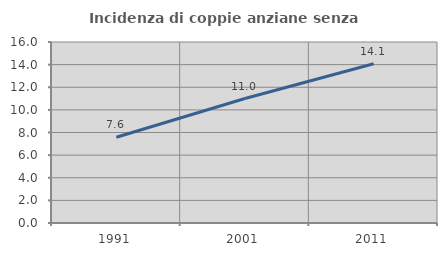
| Category | Incidenza di coppie anziane senza figli  |
|---|---|
| 1991.0 | 7.583 |
| 2001.0 | 11.004 |
| 2011.0 | 14.074 |